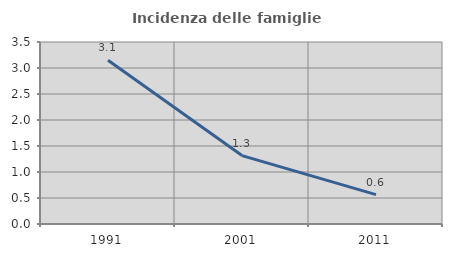
| Category | Incidenza delle famiglie numerose |
|---|---|
| 1991.0 | 3.15 |
| 2001.0 | 1.316 |
| 2011.0 | 0.565 |